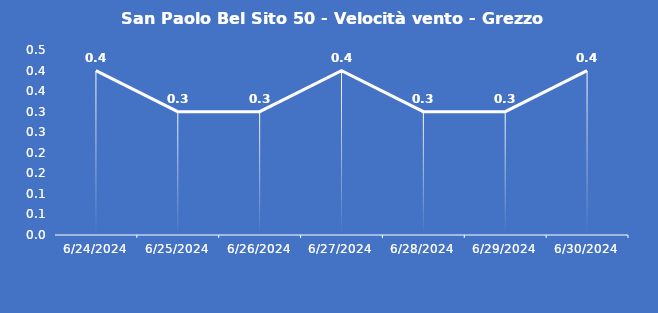
| Category | San Paolo Bel Sito 50 - Velocità vento - Grezzo (m/s) |
|---|---|
| 6/24/24 | 0.4 |
| 6/25/24 | 0.3 |
| 6/26/24 | 0.3 |
| 6/27/24 | 0.4 |
| 6/28/24 | 0.3 |
| 6/29/24 | 0.3 |
| 6/30/24 | 0.4 |